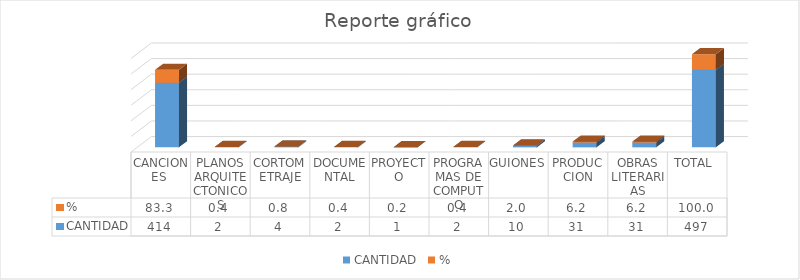
| Category | CANTIDAD | % |
|---|---|---|
| CANCIONES  | 414 | 83.3 |
| PLANOS ARQUITECTONICOS | 2 | 0.402 |
| CORTOMETRAJE | 4 | 0.805 |
| DOCUMENTAL | 2 | 0.402 |
| PROYECTO | 1 | 0.201 |
| PROGRAMAS DE COMPUTO | 2 | 0.402 |
| GUIONES | 10 | 2.012 |
| PRODUCCION | 31 | 6.237 |
| OBRAS LITERARIAS | 31 | 6.237 |
| TOTAL  | 497 | 100 |